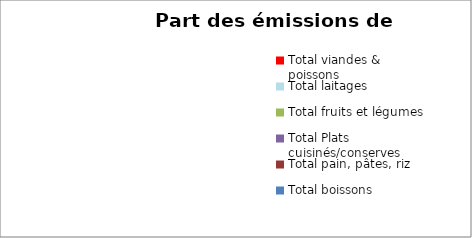
| Category | Series 0 |
|---|---|
| Total viandes & poissons | 0 |
| Total laitages | 0 |
| Total fruits et légumes | 0 |
| Total Plats cuisinés/conserves | 0 |
| Total pain, pâtes, riz | 0 |
| Total boissons | 0 |